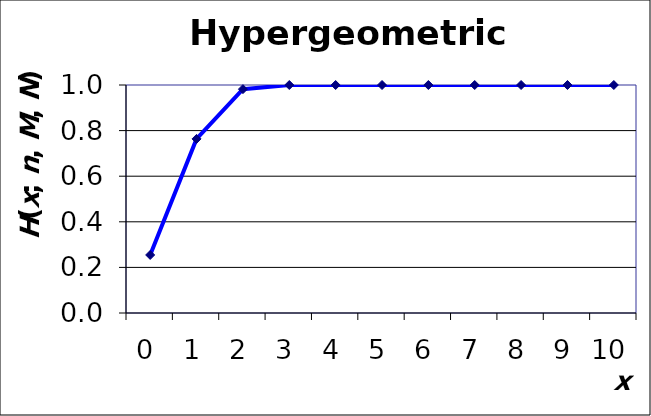
| Category | H(x; n, R, N) |
|---|---|
| 0.0 | 0.255 |
| 1.0 | 0.764 |
| 2.0 | 0.982 |
| 3.0 | 1 |
| 4.0 | 1 |
| 5.0 | 1 |
| 6.0 | 1 |
| 7.0 | 1 |
| 8.0 | 1 |
| 9.0 | 1 |
| 10.0 | 1 |